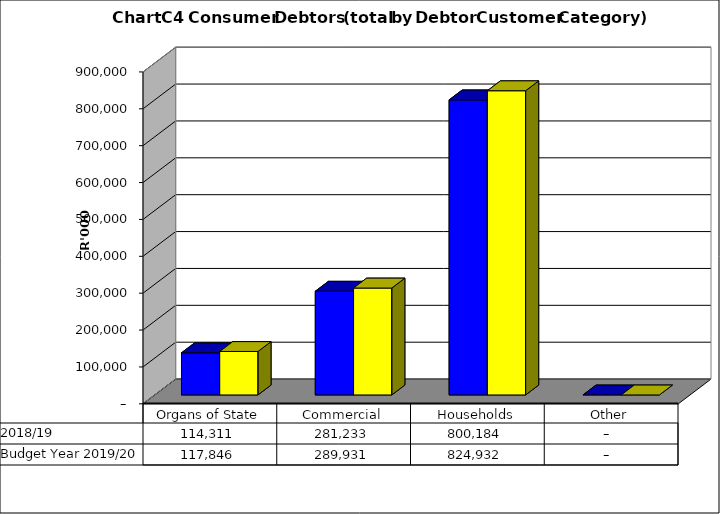
| Category |  2018/19  | Budget Year 2019/20 |
|---|---|---|
| Organs of State | 114310773.26 | 117846158 |
| Commercial | 281233048.66 | 289930978 |
| Households | 800184307.72 | 824932276 |
| Other | 0 | 0 |